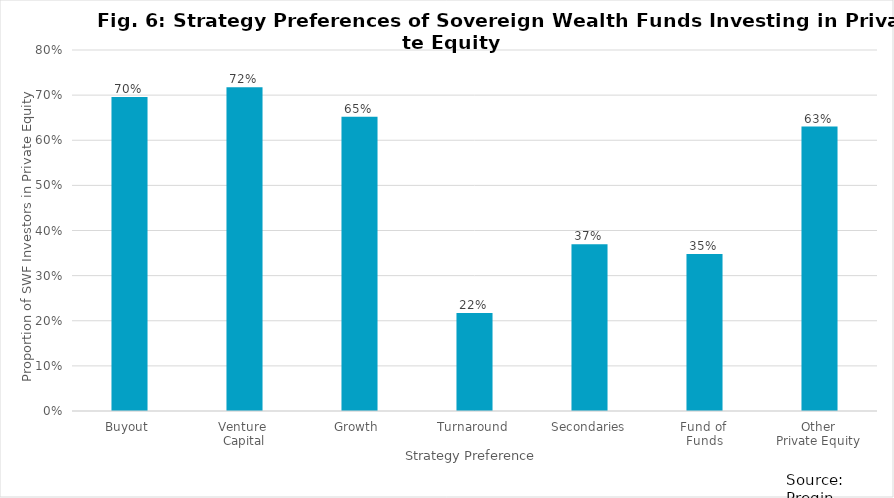
| Category | Series 0 |
|---|---|
| Buyout  | 0.696 |
| Venture 
Capital | 0.717 |
| Growth  | 0.652 |
| Turnaround | 0.217 |
| Secondaries | 0.37 |
| Fund of 
Funds | 0.348 |
| Other 
Private Equity  | 0.63 |